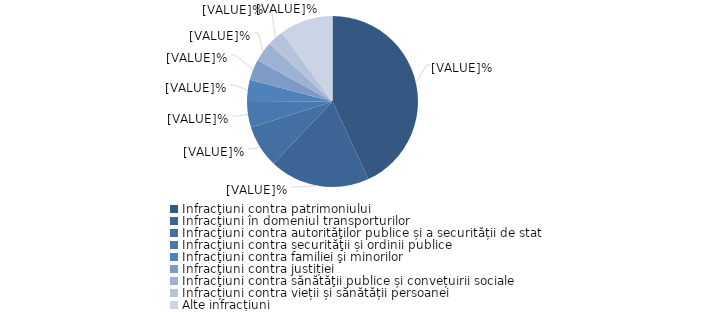
| Category | Series 0 |
|---|---|
| Infracţiuni contra patrimoniului | 43.1 |
| Infracţiuni în domeniul transporturilor | 19 |
| Infracţiuni contra autorităţilor publice și a securității de stat | 8 |
| Infracţiuni contra securităţii și ordinii publice  | 5 |
| Infracţiuni contra familiei şi minorilor | 4 |
| Infracţiuni contra justiției | 3.9 |
| Infracţiuni contra sănătăţii publice și convețuirii sociale | 3.8 |
| Infracțiuni contra vieții și sănătății persoanei | 3.1 |
| Alte infracțiuni | 10.1 |